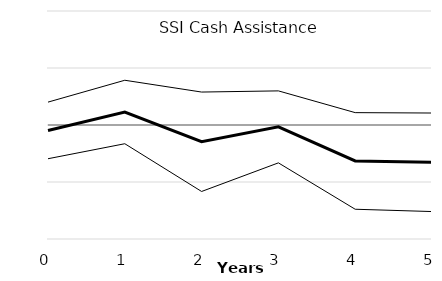
| Category | Series 3 | Series 0 | Series 1 | Series 2 |
|---|---|---|---|---|
| 0.0 | 0 | -0.952 | 4.014 | -5.918 |
| 1.0 | 0 | 2.282 | 7.85 | -3.286 |
| 2.0 | 0 | -2.942 | 5.78 | -11.663 |
| 3.0 | 0 | -0.33 | 5.985 | -6.644 |
| 4.0 | 0 | -6.304 | 2.171 | -14.779 |
| 5.0 | 0 | -6.542 | 2.102 | -15.185 |